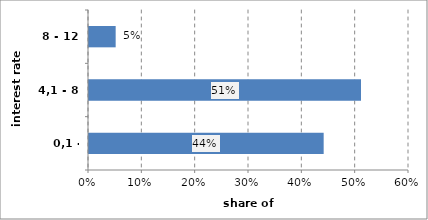
| Category | Series 0 |
|---|---|
| 0,1 - 4,1 | 0.44 |
| 4,1 - 8 | 0.51 |
| 8 - 12 | 0.05 |